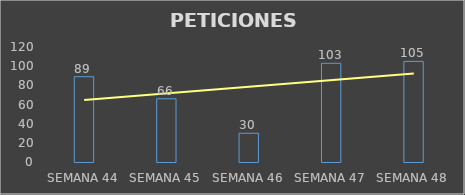
| Category | Series 0 |
|---|---|
| SEMANA 44 | 89 |
| SEMANA 45 | 66 |
| SEMANA 46 | 30 |
| SEMANA 47 | 103 |
| SEMANA 48 | 105 |